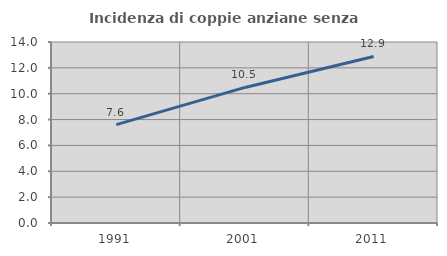
| Category | Incidenza di coppie anziane senza figli  |
|---|---|
| 1991.0 | 7.611 |
| 2001.0 | 10.487 |
| 2011.0 | 12.881 |